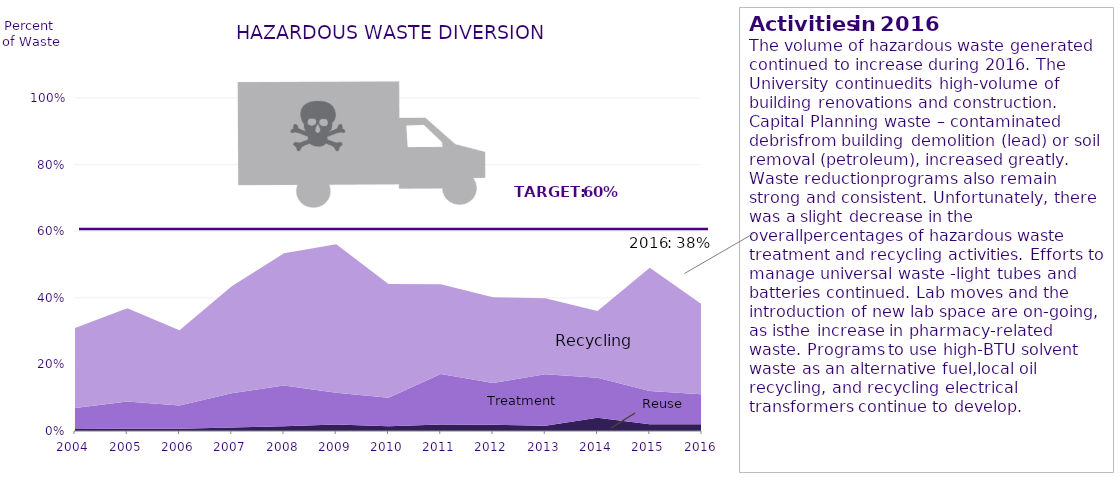
| Category | Reuse | Treatment | Recycling |
|---|---|---|---|
| 2004.0 | 0.006 | 0.063 | 0.241 |
| 2005.0 | 0.007 | 0.082 | 0.279 |
| 2006.0 | 0.007 | 0.069 | 0.226 |
| 2007.0 | 0.011 | 0.102 | 0.321 |
| 2008.0 | 0.014 | 0.122 | 0.397 |
| 2009.0 | 0.019 | 0.095 | 0.446 |
| 2010.0 | 0.014 | 0.085 | 0.342 |
| 2011.0 | 0.02 | 0.151 | 0.27 |
| 2012.0 | 0.019 | 0.126 | 0.258 |
| 2013.0 | 0.016 | 0.155 | 0.228 |
| 2014.0 | 0.04 | 0.12 | 0.2 |
| 2015.0 | 0.02 | 0.1 | 0.37 |
| 2016.0 | 0.02 | 0.09 | 0.27 |